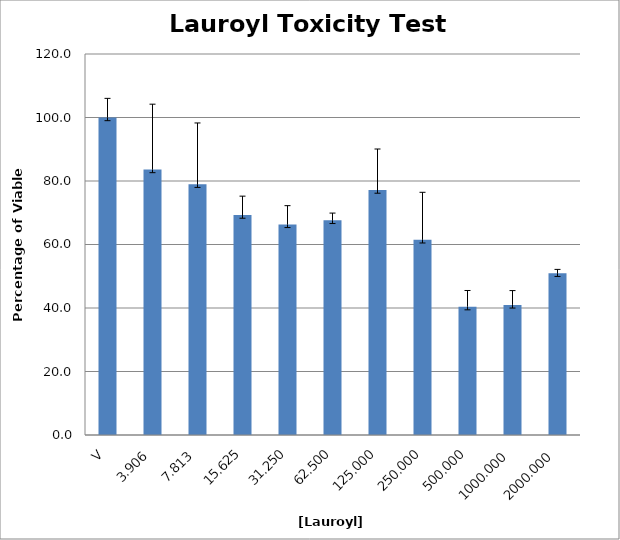
| Category | Series 0 |
|---|---|
| V | 100 |
| 3.906 | 83.62 |
| 7.813 | 78.979 |
| 15.625 | 69.277 |
| 31.250 | 66.335 |
| 62.500 | 67.601 |
| 125.000 | 77.153 |
| 250.000 | 61.477 |
| 500.000 | 40.423 |
| 1000.000 | 40.984 |
| 2000.000 | 50.94 |